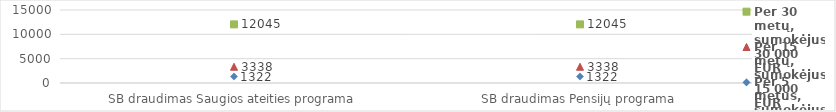
| Category | Per 30 metų, sumokėjus 30 000 EUR | Per 15 metų, sumokėjus 15 000 EUR | Per 5 metus, sumokėjus 5 000 EUR |
|---|---|---|---|
| SB draudimas Saugios ateities programa | 12045.03 | 3337.77 | 1321.573 |
| SB draudimas Pensijų programa | 12045.03 | 3337.77 | 1321.573 |